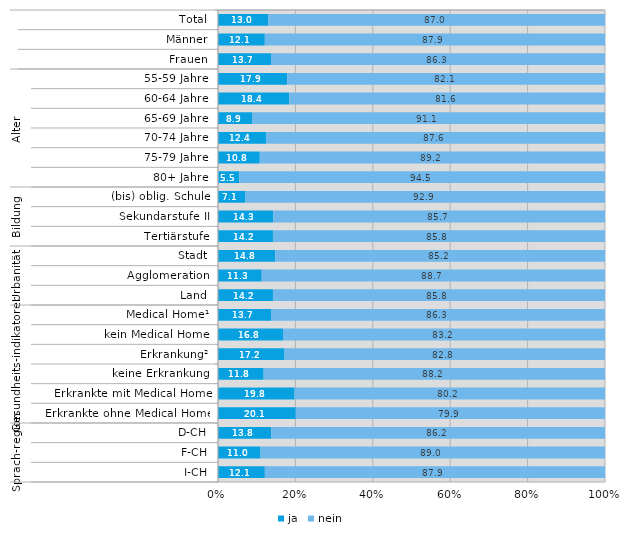
| Category | ja | nein |
|---|---|---|
| 0 | 13 | 87 |
| 1 | 12.1 | 87.9 |
| 2 | 13.7 | 86.3 |
| 3 | 17.9 | 82.1 |
| 4 | 18.4 | 81.6 |
| 5 | 8.9 | 91.1 |
| 6 | 12.4 | 87.6 |
| 7 | 10.8 | 89.2 |
| 8 | 5.5 | 94.5 |
| 9 | 7.1 | 92.9 |
| 10 | 14.3 | 85.7 |
| 11 | 14.2 | 85.8 |
| 12 | 14.8 | 85.2 |
| 13 | 11.3 | 88.7 |
| 14 | 14.2 | 85.8 |
| 15 | 13.7 | 86.3 |
| 16 | 16.8 | 83.2 |
| 17 | 17.2 | 82.8 |
| 18 | 11.8 | 88.2 |
| 19 | 19.8 | 80.2 |
| 20 | 20.1 | 79.9 |
| 21 | 13.8 | 86.2 |
| 22 | 11 | 89 |
| 23 | 12.1 | 87.9 |